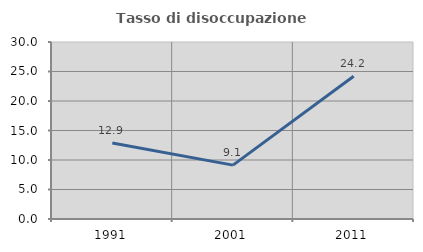
| Category | Tasso di disoccupazione giovanile  |
|---|---|
| 1991.0 | 12.891 |
| 2001.0 | 9.133 |
| 2011.0 | 24.19 |